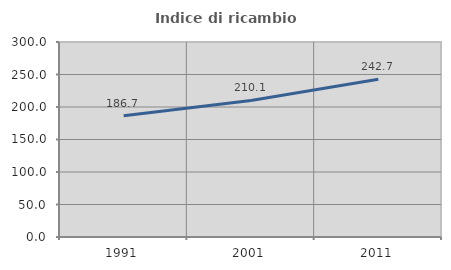
| Category | Indice di ricambio occupazionale  |
|---|---|
| 1991.0 | 186.705 |
| 2001.0 | 210.135 |
| 2011.0 | 242.667 |